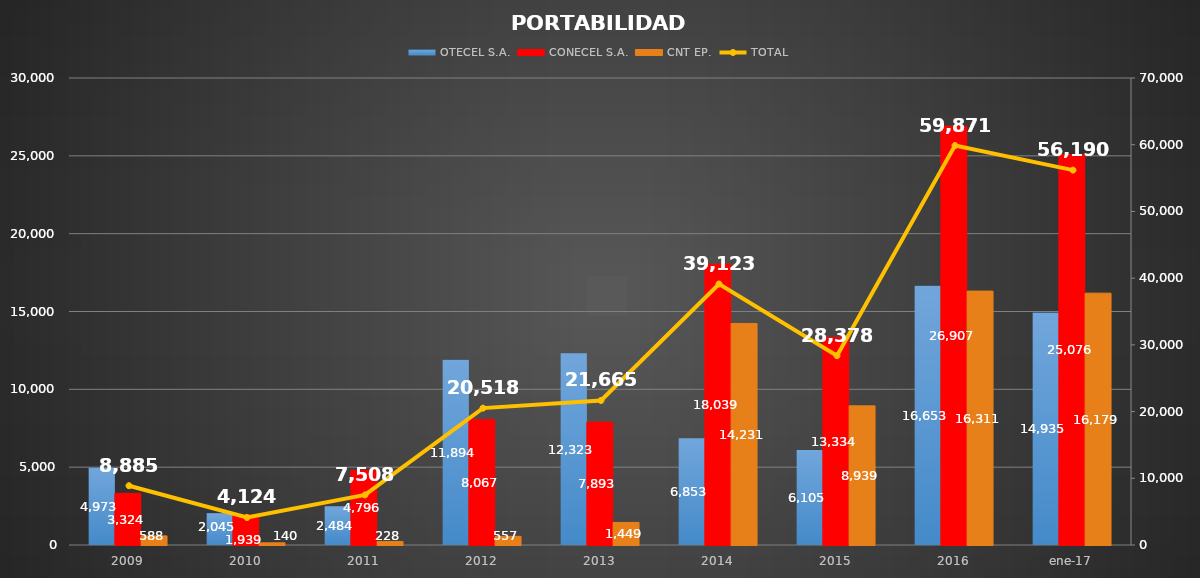
| Category | OTECEL S.A. | CONECEL S.A. | CNT EP. |
|---|---|---|---|
| 2009 | 4973 | 3324 | 588 |
| 2010 | 2045 | 1939 | 140 |
| 2011 | 2484 | 4796 | 228 |
| 2012 | 11894 | 8067 | 557 |
| 2013 | 12323 | 7893 | 1449 |
| 2014 | 6853 | 18039 | 14231 |
| 2015 | 6105 | 13334 | 8939 |
| 2016 | 16653 | 26907 | 16311 |
| ene-17 | 14935 | 25076 | 16179 |